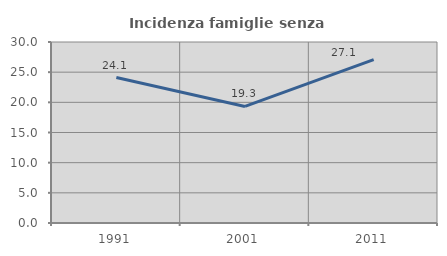
| Category | Incidenza famiglie senza nuclei |
|---|---|
| 1991.0 | 24.106 |
| 2001.0 | 19.317 |
| 2011.0 | 27.069 |